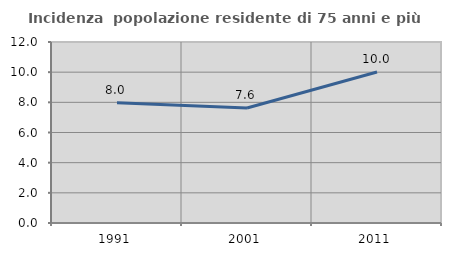
| Category | Incidenza  popolazione residente di 75 anni e più |
|---|---|
| 1991.0 | 7.979 |
| 2001.0 | 7.622 |
| 2011.0 | 10.014 |